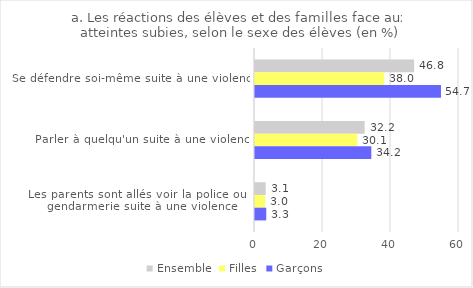
| Category | Ensemble | Filles | Garçons |
|---|---|---|---|
| Se défendre soi-même suite à une violence | 46.811 | 38.03 | 54.699 |
| Parler à quelqu'un suite à une violence | 32.249 | 30.085 | 34.209 |
| Les parents sont allés voir la police ou la gendarmerie suite à une violence | 3.139 | 2.952 | 3.309 |